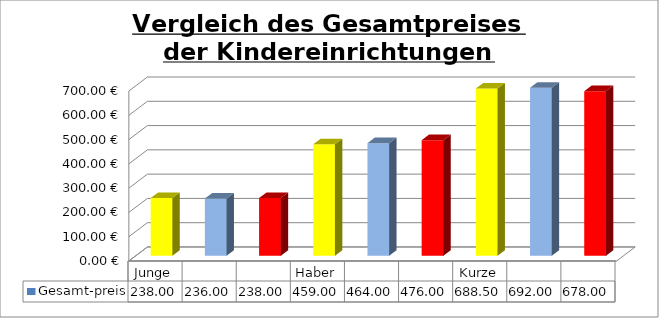
| Category | Gesamt-preis |
|---|---|
| Junge | 238 |
|  | 236 |
|  | 238 |
| Haber | 459 |
|  | 464 |
|  | 476 |
| Kurze | 688.5 |